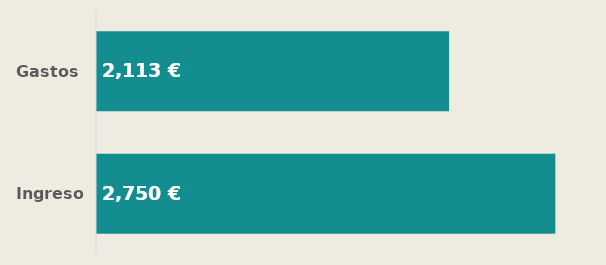
| Category | Ingresos |
|---|---|
| Ingresos | 2750 |
| Gastos | 2112.5 |